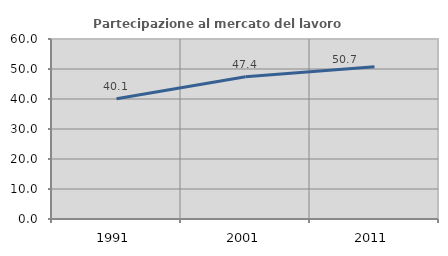
| Category | Partecipazione al mercato del lavoro  femminile |
|---|---|
| 1991.0 | 40.084 |
| 2001.0 | 47.395 |
| 2011.0 | 50.73 |